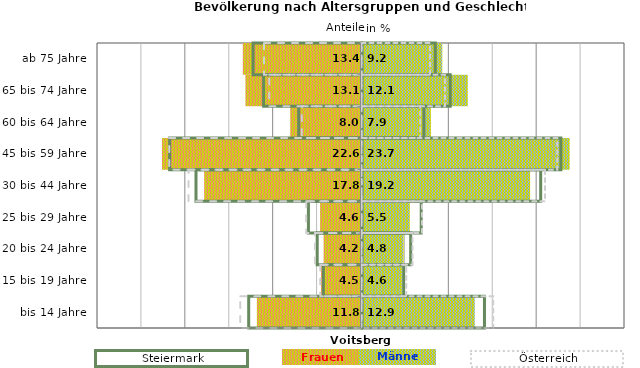
| Category | Frauen | Männer | Frauen Spalte2 | Männer Spalte2 | Frauen Spalte3 | Männer Spalte3 |
|---|---|---|---|---|---|---|
| bis 14 Jahre | -11.8 | 12.9 | 14 | -12.9 | -13.8 | 15 |
| 15 bis 19 Jahre | -4.5 | 4.6 | 4.8 | -4.4 | -4.7 | 5.1 |
| 20 bis 24 Jahre | -4.2 | 4.8 | 5.6 | -5.1 | -5.3 | 5.8 |
| 25 bis 29 Jahre | -4.6 | 5.5 | 6.8 | -6.1 | -6.3 | 6.9 |
| 30 bis 44 Jahre | -17.8 | 19.2 | 20.4 | -18.9 | -19.7 | 20.9 |
| 45 bis 59 Jahre | -22.6 | 23.7 | 22.7 | -21.9 | -21.9 | 22.3 |
| 60 bis 64 Jahre | -8 | 7.9 | 7.1 | -7.2 | -6.8 | 6.7 |
| 65 bis 74 Jahre | -13.1 | 12.1 | 10.1 | -11.2 | -10.5 | 9.5 |
| ab 75 Jahre | -13.4 | 9.2 | 8.4 | -12.4 | -11.1 | 7.8 |